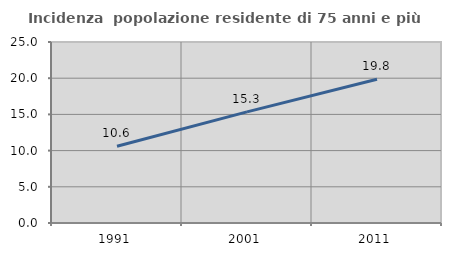
| Category | Incidenza  popolazione residente di 75 anni e più |
|---|---|
| 1991.0 | 10.595 |
| 2001.0 | 15.347 |
| 2011.0 | 19.844 |